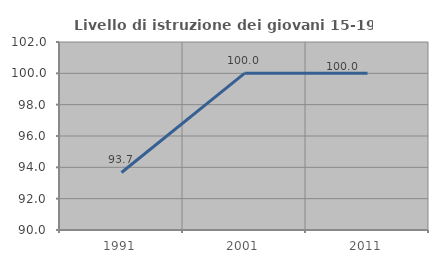
| Category | Livello di istruzione dei giovani 15-19 anni |
|---|---|
| 1991.0 | 93.671 |
| 2001.0 | 100 |
| 2011.0 | 100 |